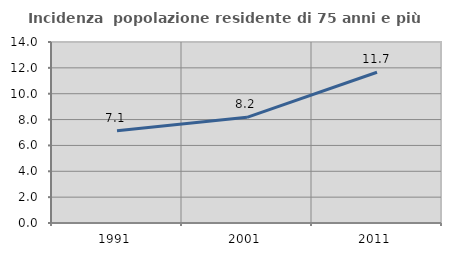
| Category | Incidenza  popolazione residente di 75 anni e più |
|---|---|
| 1991.0 | 7.143 |
| 2001.0 | 8.174 |
| 2011.0 | 11.657 |